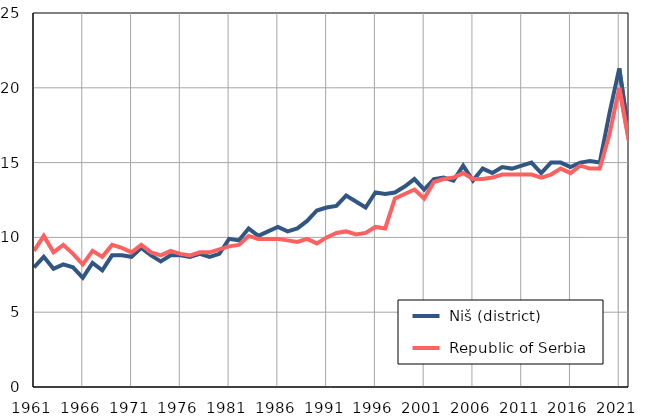
| Category |  Niš (district) |  Republic of Serbia |
|---|---|---|
| 1961.0 | 8 | 9.1 |
| 1962.0 | 8.7 | 10.1 |
| 1963.0 | 7.9 | 9 |
| 1964.0 | 8.2 | 9.5 |
| 1965.0 | 8 | 8.9 |
| 1966.0 | 7.3 | 8.2 |
| 1967.0 | 8.3 | 9.1 |
| 1968.0 | 7.8 | 8.7 |
| 1969.0 | 8.8 | 9.5 |
| 1970.0 | 8.8 | 9.3 |
| 1971.0 | 8.7 | 9 |
| 1972.0 | 9.3 | 9.5 |
| 1973.0 | 8.8 | 9 |
| 1974.0 | 8.4 | 8.8 |
| 1975.0 | 8.8 | 9.1 |
| 1976.0 | 8.8 | 8.9 |
| 1977.0 | 8.7 | 8.8 |
| 1978.0 | 8.9 | 9 |
| 1979.0 | 8.7 | 9 |
| 1980.0 | 8.9 | 9.2 |
| 1981.0 | 9.9 | 9.4 |
| 1982.0 | 9.8 | 9.5 |
| 1983.0 | 10.6 | 10.1 |
| 1984.0 | 10.1 | 9.9 |
| 1985.0 | 10.4 | 9.9 |
| 1986.0 | 10.7 | 9.9 |
| 1987.0 | 10.4 | 9.8 |
| 1988.0 | 10.6 | 9.7 |
| 1989.0 | 11.1 | 9.9 |
| 1990.0 | 11.8 | 9.6 |
| 1991.0 | 12 | 10 |
| 1992.0 | 12.1 | 10.3 |
| 1993.0 | 12.8 | 10.4 |
| 1994.0 | 12.4 | 10.2 |
| 1995.0 | 12 | 10.3 |
| 1996.0 | 13 | 10.7 |
| 1997.0 | 12.9 | 10.6 |
| 1998.0 | 13 | 12.6 |
| 1999.0 | 13.4 | 12.9 |
| 2000.0 | 13.9 | 13.2 |
| 2001.0 | 13.2 | 12.6 |
| 2002.0 | 13.9 | 13.7 |
| 2003.0 | 14 | 13.9 |
| 2004.0 | 13.8 | 14 |
| 2005.0 | 14.8 | 14.3 |
| 2006.0 | 13.8 | 13.9 |
| 2007.0 | 14.6 | 13.9 |
| 2008.0 | 14.3 | 14 |
| 2009.0 | 14.7 | 14.2 |
| 2010.0 | 14.6 | 14.2 |
| 2011.0 | 14.8 | 14.2 |
| 2012.0 | 15 | 14.2 |
| 2013.0 | 14.3 | 14 |
| 2014.0 | 15 | 14.2 |
| 2015.0 | 15 | 14.6 |
| 2016.0 | 14.7 | 14.3 |
| 2017.0 | 15 | 14.8 |
| 2018.0 | 15.1 | 14.6 |
| 2019.0 | 15 | 14.6 |
| 2020.0 | 18.3 | 16.9 |
| 2021.0 | 21.3 | 20 |
| 2022.0 | 16.8 | 16.4 |